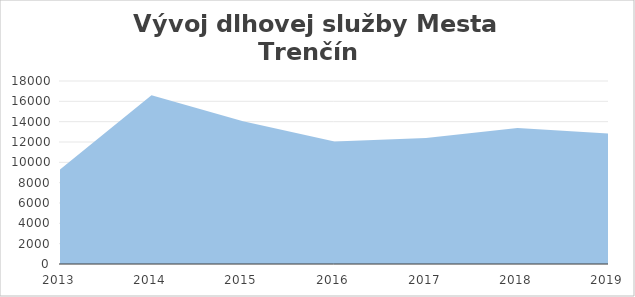
| Category | Series 0 | Series 1 |
|---|---|---|
| 2013.0 | 2013 | 9293 |
| 2014.0 | 2014 | 16598 |
| 2015.0 | 2015 | 14037 |
| 2016.0 | 2016 | 12053 |
| 2017.0 | 2017 | 12394 |
| 2018.0 | 2018 | 13381 |
| 2019.0 | 2019 | 12837 |